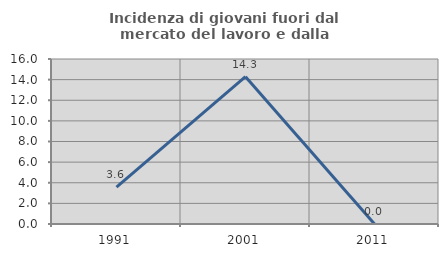
| Category | Incidenza di giovani fuori dal mercato del lavoro e dalla formazione  |
|---|---|
| 1991.0 | 3.571 |
| 2001.0 | 14.286 |
| 2011.0 | 0 |